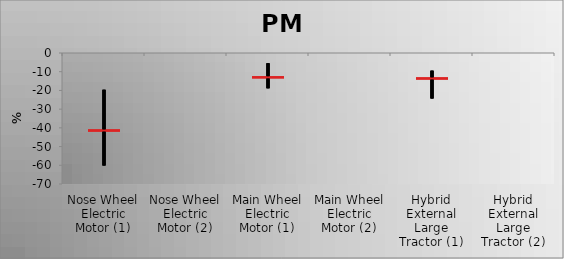
| Category | Series 0 | Series 1 | Series 2 | Series 3 |
|---|---|---|---|---|
| Nose Wheel Electric Motor (1) | -41.921 | -19.658 | -60.084 | -40.921 |
| Nose Wheel Electric Motor (2) | 0 | 0 | 0 | 0 |
| Main Wheel Electric Motor (1) | -13.501 | -5.503 | -18.83 | -12.501 |
| Main Wheel Electric Motor (2) | 0 | 0 | 0 | 0 |
| Hybrid External Large Tractor (1) | -14.11 | -9.47 | -24.272 | -13.11 |
| Hybrid External Large Tractor (2) | 0 | 0 | 0 | 0 |